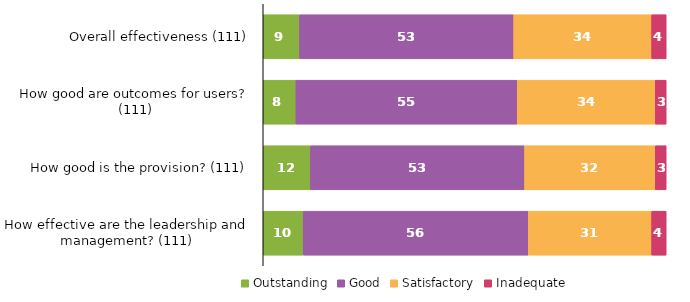
| Category | Outstanding | Good | Satisfactory | Inadequate |
|---|---|---|---|---|
| Overall effectiveness (111) | 9.009 | 53.153 | 34.234 | 3.604 |
| How good are outcomes for users? (111) | 8.108 | 54.955 | 34.234 | 2.703 |
| How good is the provision? (111) | 11.712 | 53.153 | 32.432 | 2.703 |
| How effective are the leadership and management? (111) | 9.91 | 55.856 | 30.631 | 3.604 |